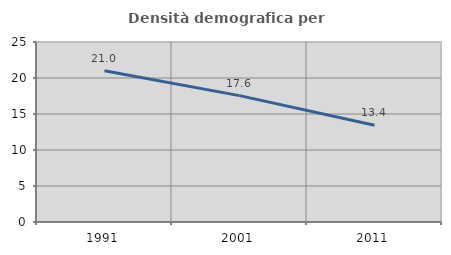
| Category | Densità demografica |
|---|---|
| 1991.0 | 21.002 |
| 2001.0 | 17.555 |
| 2011.0 | 13.433 |